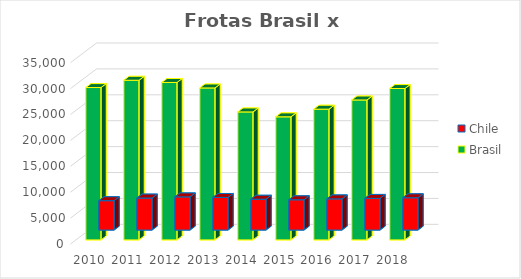
| Category | Chile | Brasil |
|---|---|---|
| 2010.0 | 5669 | 29406 |
| 2011.0 | 6179 | 30812 |
| 2012.0 | 6402 | 30389 |
| 2013.0 | 6297 | 29329 |
| 2014.0 | 5955 | 24701 |
| 2015.0 | 5842 | 23754 |
| 2016.0 | 6017 | 25230 |
| 2017.0 | 6112 | 27009 |
| 2018.0 | 6232 | 29216 |